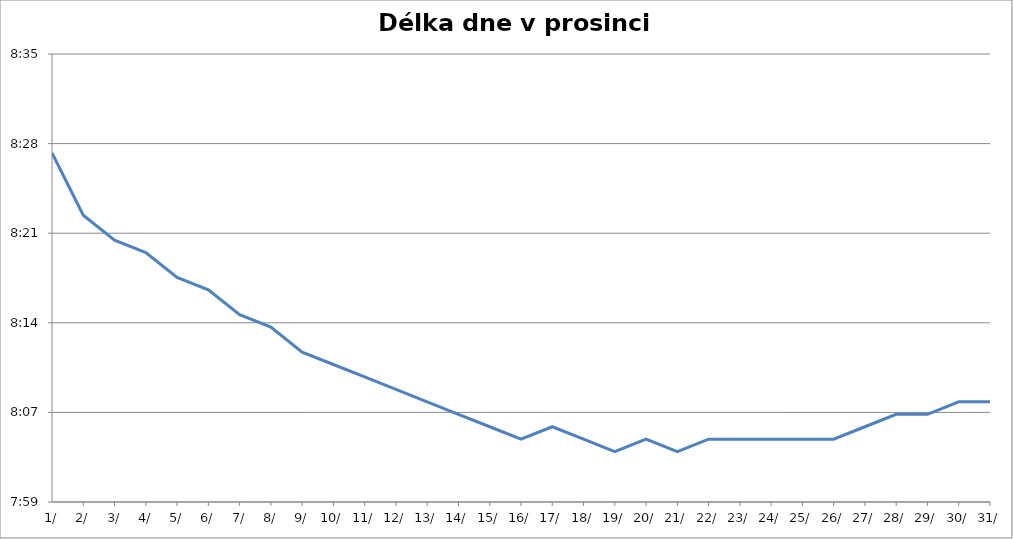
| Category | datum |
|---|---|
| 2015-12-01 | 0.353 |
| 2015-12-02 | 0.349 |
| 2015-12-03 | 0.348 |
| 2015-12-04 | 0.347 |
| 2015-12-05 | 0.346 |
| 2015-12-06 | 0.345 |
| 2015-12-07 | 0.344 |
| 2015-12-08 | 0.343 |
| 2015-12-09 | 0.342 |
| 2015-12-10 | 0.341 |
| 2015-12-11 | 0.34 |
| 2015-12-12 | 0.34 |
| 2015-12-13 | 0.339 |
| 2015-12-14 | 0.338 |
| 2015-12-15 | 0.337 |
| 2015-12-16 | 0.337 |
| 2015-12-17 | 0.337 |
| 2015-12-18 | 0.337 |
| 2015-12-19 | 0.336 |
| 2015-12-20 | 0.337 |
| 2015-12-21 | 0.336 |
| 2015-12-22 | 0.337 |
| 2015-12-23 | 0.337 |
| 2015-12-24 | 0.337 |
| 2015-12-25 | 0.337 |
| 2015-12-26 | 0.337 |
| 2015-12-27 | 0.337 |
| 2015-12-28 | 0.338 |
| 2015-12-29 | 0.338 |
| 2015-12-30 | 0.339 |
| 2015-12-31 | 0.339 |